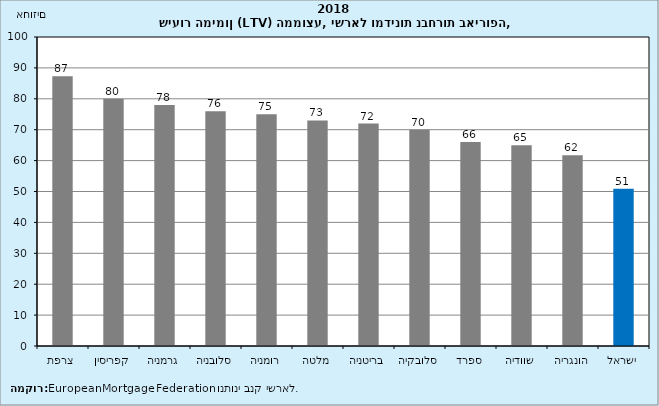
| Category | שיעור מימון ממוצע 2018 |
|---|---|
| צרפת | 87.3 |
| קפריסין | 80 |
| גרמניה | 78 |
| סלובניה | 76 |
| רומניה | 75 |
| מלטה | 73 |
| בריטניה | 72 |
| סלובקיה | 70 |
| ספרד | 66 |
| שוודיה | 65 |
| הונגריה | 61.76 |
| ישראל | 50.9 |